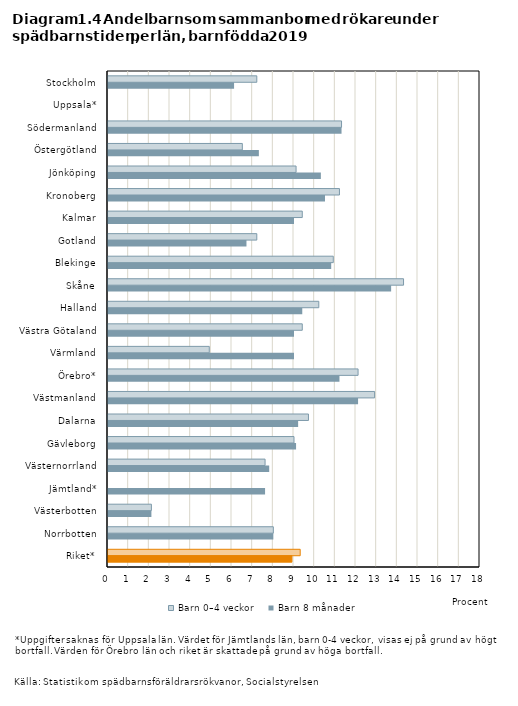
| Category | Barn 0–4 veckor | Barn 8 månader |
|---|---|---|
| Stockholm | 7.2 | 6.1 |
| Uppsala* | 0 | 0 |
| Södermanland | 11.3 | 11.3 |
| Östergötland | 6.5 | 7.3 |
| Jönköping | 9.1 | 10.3 |
| Kronoberg | 11.2 | 10.5 |
| Kalmar | 9.4 | 9 |
| Gotland | 7.2 | 6.7 |
| Blekinge | 10.9 | 10.8 |
| Skåne | 14.3 | 13.7 |
| Halland | 10.2 | 9.4 |
| Västra Götaland | 9.4 | 9 |
| Värmland | 4.9 | 9 |
| Örebro* | 12.1 | 11.2 |
| Västmanland | 12.9 | 12.1 |
| Dalarna | 9.7 | 9.2 |
| Gävleborg | 9 | 9.1 |
| Västernorrland | 7.6 | 7.8 |
| Jämtland* | 0 | 7.6 |
| Västerbotten | 2.1 | 2.1 |
| Norrbotten | 8 | 8 |
| Riket* | 9.3 | 8.9 |